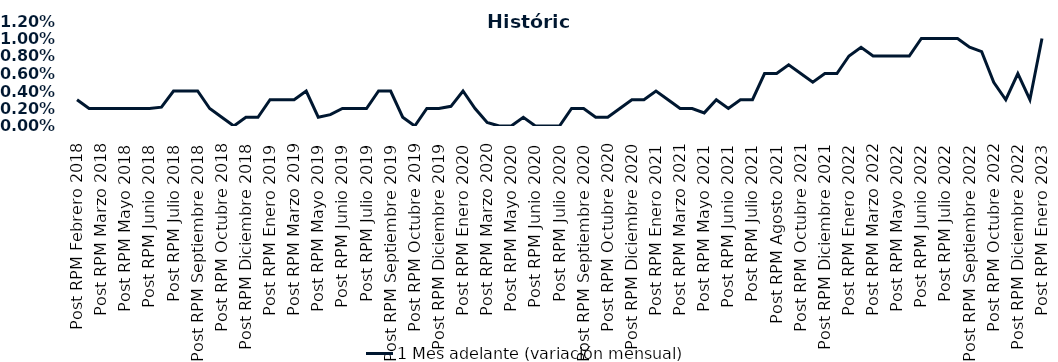
| Category | 1 Mes adelante (variación mensual) |
|---|---|
| Post RPM Febrero 2018 | 0.003 |
| Pre RPM Marzo 2018 | 0.002 |
| Post RPM Marzo 2018 | 0.002 |
| Pre RPM Mayo 2018 | 0.002 |
| Post RPM Mayo 2018 | 0.002 |
| Pre RPM Junio 2018 | 0.002 |
| Post RPM Junio 2018 | 0.002 |
| Pre RPM Julio 2018 | 0.002 |
| Post RPM Julio 2018 | 0.004 |
| Pre RPM Septiembre 2018 | 0.004 |
| Post RPM Septiembre 2018 | 0.004 |
| Pre RPM Octubre 2018 | 0.002 |
| Post RPM Octubre 2018 | 0.001 |
| Pre RPM Diciembre 2018 | 0 |
| Post RPM Diciembre 2018 | 0.001 |
| Pre RPM Enero 2019 | 0.001 |
| Post RPM Enero 2019 | 0.003 |
| Pre RPM Marzo 2019 | 0.003 |
| Post RPM Marzo 2019 | 0.003 |
| Pre RPM Mayo 2019 | 0.004 |
| Post RPM Mayo 2019 | 0.001 |
| Pre RPM Junio 2019 | 0.001 |
| Post RPM Junio 2019 | 0.002 |
| Pre RPM Julio 2019 | 0.002 |
| Post RPM Julio 2019 | 0.002 |
| Pre RPM Septiembre 2019 | 0.004 |
| Post RPM Septiembre 2019 | 0.004 |
| Pre RPM Octubre 2019 | 0.001 |
| Post RPM Octubre 2019 | 0 |
| Pre RPM Diciembre 2019 | 0.002 |
| Post RPM Diciembre 2019 | 0.002 |
| Pre RPM Enero 2020 | 0.002 |
| Post RPM Enero 2020 | 0.004 |
| Pre RPM Marzo 2020 | 0.002 |
| Post RPM Marzo 2020 | 0 |
| Pre RPM Mayo 2020 | 0 |
| Post RPM Mayo 2020 | 0 |
| Pre RPM Junio 2020 | 0.001 |
| Post RPM Junio 2020 | 0 |
| Pre RPM Julio 2020 | 0 |
| Post RPM Julio 2020 | 0 |
| Pre RPM Septiembre 2020 | 0.002 |
| Post RPM Septiembre 2020 | 0.002 |
| Pre RPM Octubre 2020 | 0.001 |
| Post RPM Octubre 2020 | 0.001 |
| Pre RPM Diciembre 2020 | 0.002 |
| Post RPM Diciembre 2020 | 0.003 |
| Pre RPM Enero 2021 | 0.003 |
| Post RPM Enero 2021 | 0.004 |
| Pre RPM Marzo 2021 | 0.003 |
| Post RPM Marzo 2021 | 0.002 |
| Pre RPM Mayo 2021 | 0.002 |
| Post RPM Mayo 2021 | 0.002 |
| Pre RPM Junio 2021 | 0.003 |
| Post RPM Junio 2021 | 0.002 |
| Pre RPM Julio 2021 | 0.003 |
| Post RPM Julio 2021 | 0.003 |
| Pre RPM Agosto 2021 | 0.006 |
| Post RPM Agosto 2021 | 0.006 |
| Pre RPM Octubre 2021 | 0.007 |
| Post RPM Octubre 2021 | 0.006 |
| Pre RPM Diciembre 2021 | 0.005 |
| Post RPM Diciembre 2021 | 0.006 |
| Pre RPM Enero 2022 | 0.006 |
| Post RPM Enero 2022 | 0.008 |
| Pre RPM Marzo 2022 | 0.009 |
| Post RPM Marzo 2022 | 0.008 |
| Pre RPM Mayo 2022 | 0.008 |
| Post RPM Mayo 2022 | 0.008 |
| Pre RPM Junio 2022 | 0.008 |
| Post RPM Junio 2022 | 0.01 |
| Pre RPM Julio 2022 | 0.01 |
| Post RPM Julio 2022 | 0.01 |
| Pre RPM Septiembre 2022 | 0.01 |
| Post RPM Septiembre 2022 | 0.009 |
| Pre RPM Octubre 2022 | 0.008 |
| Post RPM Octubre 2022 | 0.005 |
| Pre RPM Diciembre 2022 | 0.003 |
| Post RPM Diciembre 2022 | 0.006 |
| Pre RPM Enero 2023 | 0.003 |
| Post RPM Enero 2023 | 0.01 |